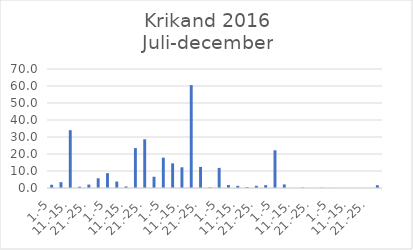
| Category | Series 0 |
|---|---|
| 1.-5 | 1.92 |
| 6.-10. | 3.411 |
| 11.-15. | 34 |
| 16.-20. | 0.766 |
| 21.-25. | 2.011 |
| 26.-31. | 5.717 |
| 1.-5 | 8.726 |
| 6.-10. | 3.787 |
| 11.-15. | 0.911 |
| 16.-20. | 23.473 |
| 21.-25. | 28.65 |
| 26.-31. | 6.625 |
| 1.-5 | 17.854 |
| 6.-10. | 14.495 |
| 11.-15. | 12.173 |
| 16.-20. | 60.504 |
| 21.-25. | 12.41 |
| 26.-30. | 0.387 |
| 1.-5 | 11.825 |
| 6.-10. | 1.783 |
| 11.-15. | 1.271 |
| 16.-20. | 0.503 |
| 21.-25. | 1.299 |
| 26.-31. | 1.691 |
| 1.-5 | 22.194 |
| 6.-10. | 2.105 |
| 11.-15. | 0 |
| 16.-20. | 0.264 |
| 21.-25. | 0 |
| 26.-30. | 0.133 |
| 1.-5 | 0.08 |
| 6.-10. | 0 |
| 11.-15. | 0 |
| 16.-20. | 0 |
| 21.-25. | 0 |
| 26.-31. | 1.652 |